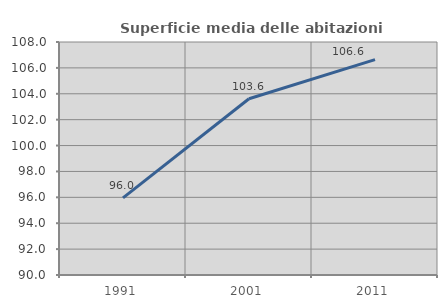
| Category | Superficie media delle abitazioni occupate |
|---|---|
| 1991.0 | 95.956 |
| 2001.0 | 103.614 |
| 2011.0 | 106.633 |